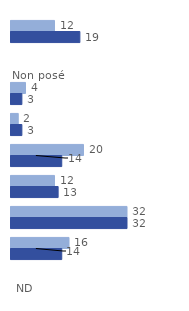
| Category | 2008-2012 | 2013-2018 |
|---|---|---|
| 0 | 12 | 19 |
| 1 | 0 | 0 |
| 2 | 4 | 3 |
| 3 | 2 | 3 |
| 4 | 20 | 14 |
| 5 | 12 | 13 |
| 6 | 32 | 32 |
| 7 | 16 | 14 |
| 8 | 0 | 0 |